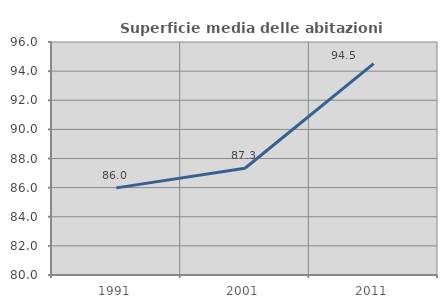
| Category | Superficie media delle abitazioni occupate |
|---|---|
| 1991.0 | 85.982 |
| 2001.0 | 87.329 |
| 2011.0 | 94.514 |